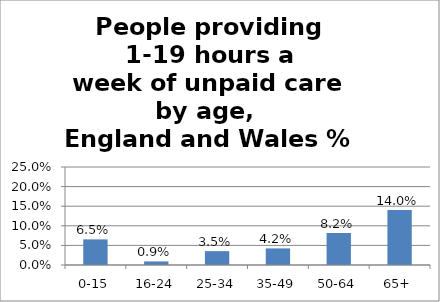
| Category | Series 0 |
|---|---|
| 0-15 | 0.065 |
| 16-24 | 0.009 |
| 25-34 | 0.035 |
| 35-49 | 0.042 |
| 50-64 | 0.082 |
| 65+ | 0.14 |